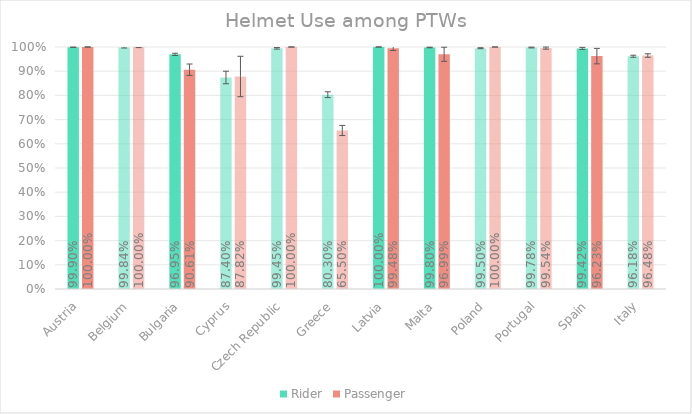
| Category | Rider | Passenger |
|---|---|---|
| Austria | 0.999 | 1 |
| Belgium | 0.998 | 1 |
| Bulgaria | 0.97 | 0.906 |
| Cyprus | 0.874 | 0.878 |
| Czech Republic | 0.995 | 1 |
| Greece | 0.803 | 0.655 |
| Latvia | 1 | 0.995 |
| Malta | 0.998 | 0.97 |
| Poland | 0.995 | 1 |
| Portugal | 0.998 | 0.995 |
| Spain | 0.994 | 0.962 |
| Italy | 0.962 | 0.965 |